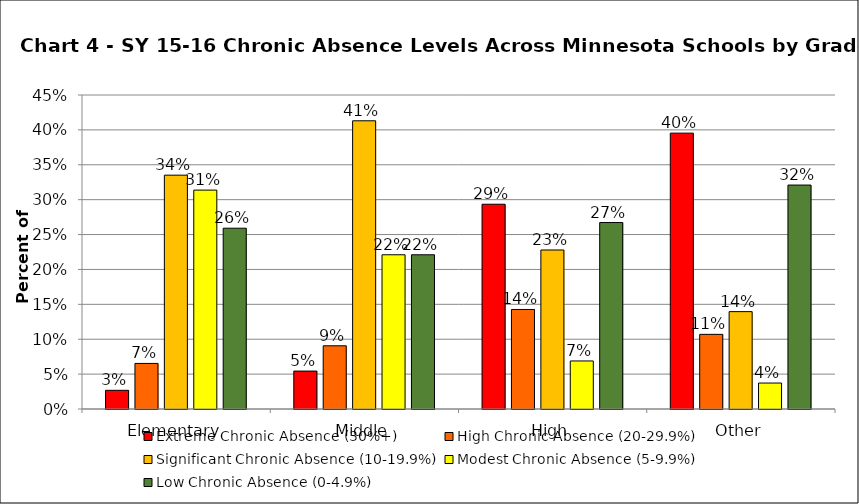
| Category | Extreme Chronic Absence (30%+) | High Chronic Absence (20-29.9%) | Significant Chronic Absence (10-19.9%) | Modest Chronic Absence (5-9.9%) | Low Chronic Absence (0-4.9%) |
|---|---|---|---|---|---|
| 0 | 0.027 | 0.065 | 0.335 | 0.314 | 0.259 |
| 1 | 0.054 | 0.091 | 0.413 | 0.221 | 0.221 |
| 2 | 0.293 | 0.143 | 0.228 | 0.069 | 0.267 |
| 3 | 0.395 | 0.107 | 0.14 | 0.037 | 0.321 |